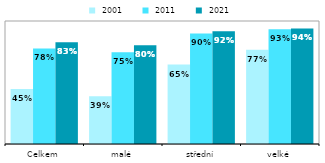
| Category |  2001 |  2011 |  2021 |
|---|---|---|---|
| Celkem | 0.446 | 0.777 | 0.828 |
| malé | 0.388 | 0.746 | 0.803 |
| střední | 0.646 | 0.899 | 0.917 |
| velké | 0.766 | 0.932 | 0.94 |